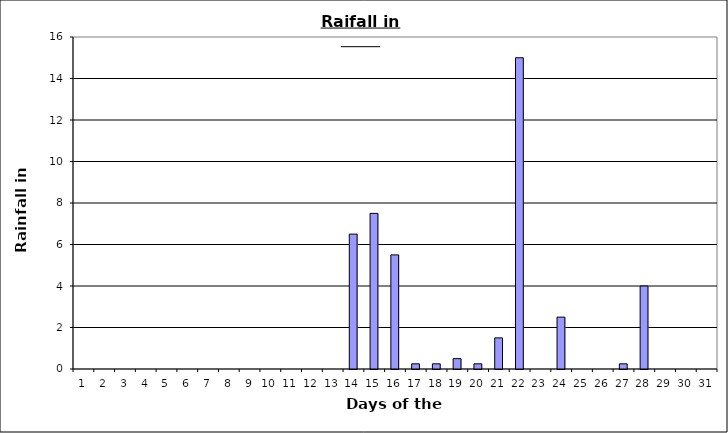
| Category | Rain |
|---|---|
| 0 | 0 |
| 1 | 0 |
| 2 | 0 |
| 3 | 0 |
| 4 | 0 |
| 5 | 0 |
| 6 | 0 |
| 7 | 0 |
| 8 | 0 |
| 9 | 0 |
| 10 | 0 |
| 11 | 0 |
| 12 | 0 |
| 13 | 6.5 |
| 14 | 7.5 |
| 15 | 5.5 |
| 16 | 0.25 |
| 17 | 0.25 |
| 18 | 0.5 |
| 19 | 0.25 |
| 20 | 1.5 |
| 21 | 15 |
| 22 | 0 |
| 23 | 2.5 |
| 24 | 0 |
| 25 | 0 |
| 26 | 0.25 |
| 27 | 4 |
| 28 | 0 |
| 29 | 0 |
| 30 | 0 |